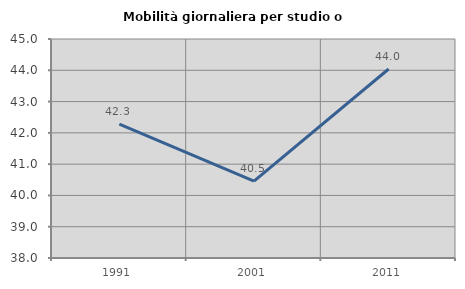
| Category | Mobilità giornaliera per studio o lavoro |
|---|---|
| 1991.0 | 42.281 |
| 2001.0 | 40.455 |
| 2011.0 | 44.041 |